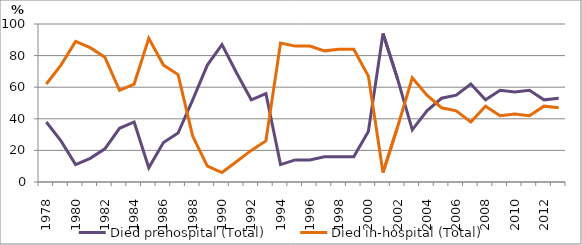
| Category | Died prehospital (Total) | Died in-hospital (Total) |
|---|---|---|
| 1978.0 | 38 | 62 |
| 1979.0 | 26 | 74 |
| 1980.0 | 11 | 89 |
| 1981.0 | 15 | 85 |
| 1982.0 | 21 | 79 |
| 1983.0 | 34 | 58 |
| 1984.0 | 38 | 62 |
| 1985.0 | 9 | 91 |
| 1986.0 | 25 | 74 |
| 1987.0 | 31 | 68 |
| 1988.0 | 52 | 29 |
| 1989.0 | 74 | 10 |
| 1990.0 | 87 | 6 |
| 1991.0 | 69 | 13 |
| 1992.0 | 52 | 20 |
| 1993.0 | 56 | 26 |
| 1994.0 | 11 | 88 |
| 1995.0 | 14 | 86 |
| 1996.0 | 14 | 86 |
| 1997.0 | 16 | 83 |
| 1998.0 | 16 | 84 |
| 1999.0 | 16 | 84 |
| 2000.0 | 32 | 67 |
| 2001.0 | 94 | 6 |
| 2002.0 | 65 | 35 |
| 2003.0 | 33 | 66 |
| 2004.0 | 45 | 55 |
| 2005.0 | 53 | 47 |
| 2006.0 | 55 | 45 |
| 2007.0 | 62 | 38 |
| 2008.0 | 52 | 48 |
| 2009.0 | 58 | 42 |
| 2010.0 | 57 | 43 |
| 2011.0 | 58 | 42 |
| 2012.0 | 52 | 48 |
| 2013.0 | 53 | 47 |